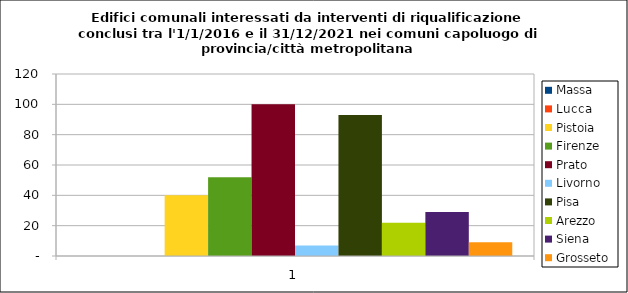
| Category | Massa | Lucca | Pistoia | Firenze | Prato | Livorno | Pisa | Arezzo | Siena | Grosseto |
|---|---|---|---|---|---|---|---|---|---|---|
| 0 | 0 | 0 | 40 | 52 | 100 | 7 | 93 | 22 | 29 | 9 |